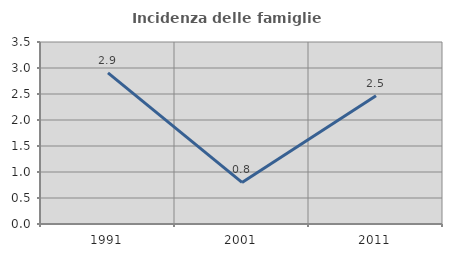
| Category | Incidenza delle famiglie numerose |
|---|---|
| 1991.0 | 2.905 |
| 2001.0 | 0.8 |
| 2011.0 | 2.465 |